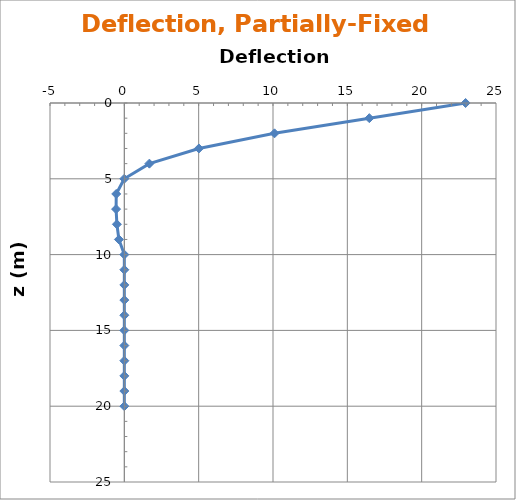
| Category | 0.5 |
|---|---|
| 22.954685653426562 | 0 |
| 16.47861117363203 | 1 |
| 10.100965485087293 | 2 |
| 5.015643911511134 | 3 |
| 1.6846253431897824 | 4 |
| -0.005710114418536411 | 5 |
| -0.5446909979792559 | 6 |
| -0.5538918494771098 | 7 |
| -0.5000980853121845 | 8 |
| -0.3646983712958585 | 9 |
| 0.0 | 10 |
| 0.0 | 11 |
| 0.0 | 12 |
| 0.0 | 13 |
| 0.0 | 14 |
| 0.0 | 15 |
| 0.0 | 16 |
| 0.0 | 17 |
| 0.0 | 18 |
| 0.0 | 19 |
| 0.0 | 20 |